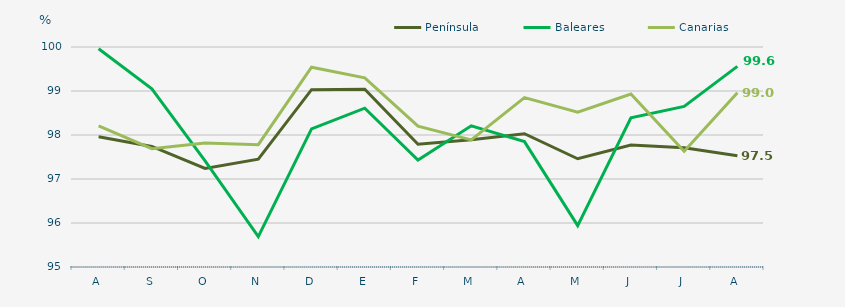
| Category | Península | Baleares | Canarias |
|---|---|---|---|
| A | 97.96 | 99.96 | 98.21 |
| S | 97.74 | 99.05 | 97.69 |
| O | 97.24 | 97.41 | 97.82 |
| N | 97.45 | 95.69 | 97.78 |
| D | 99.03 | 98.14 | 99.54 |
| E | 99.04 | 98.61 | 99.3 |
| F | 97.79 | 97.43 | 98.2 |
| M | 97.89 | 98.21 | 97.89 |
| A | 98.03 | 97.85 | 98.85 |
| M | 97.46 | 95.94 | 98.52 |
| J | 97.77 | 98.39 | 98.93 |
| J | 97.71 | 98.65 | 97.63 |
| A | 97.53 | 99.56 | 98.96 |